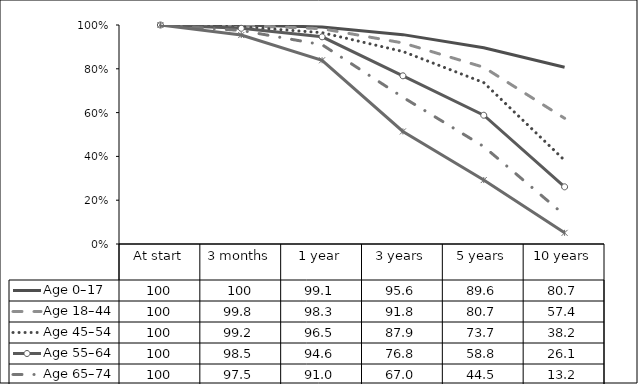
| Category | Age 0–17 | Age 18–44  | Age 45–54  | Age 55–64  | Age 65–74  | Age 75+  |
|---|---|---|---|---|---|---|
| At start | 100 | 100 | 100 | 100 | 100 | 100 |
| 3 months | 100 | 99.8 | 99.2 | 98.5 | 97.5 | 95.4 |
| 1 year | 99.1 | 98.3 | 96.5 | 94.6 | 91 | 83.9 |
| 3 years | 95.6 | 91.8 | 87.9 | 76.8 | 67 | 51.4 |
| 5 years | 89.6 | 80.7 | 73.7 | 58.8 | 44.5 | 29.2 |
| 10 years | 80.7 | 57.4 | 38.2 | 26.1 | 13.2 | 5.1 |